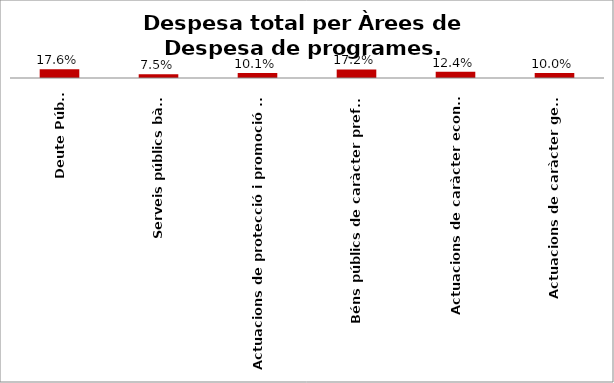
| Category | Series 0 |
|---|---|
| Deute Públic | 0.176 |
| Serveis públics bàsics | 0.075 |
| Actuacions de protecció i promoció social | 0.101 |
| Béns públics de caràcter preferent | 0.172 |
| Actuacions de caràcter econòmic | 0.124 |
| Actuacions de caràcter general | 0.1 |